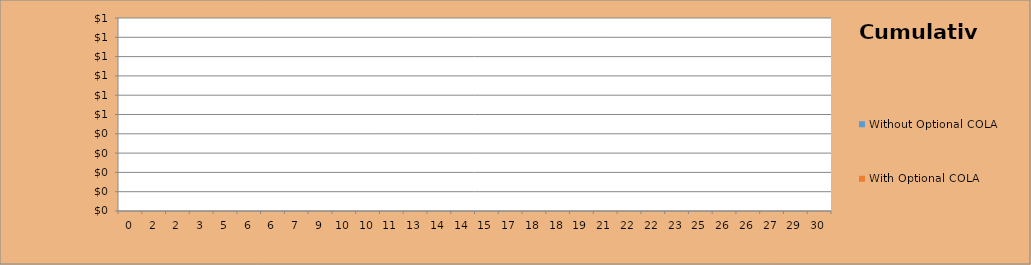
| Category | Without Optional COLA | With Optional COLA |
|---|---|---|
| 0.0 | 0 | 0 |
| 1.5003422313483916 | 0 | 0 |
| 2.4996577686516086 | 0 | 0 |
| 3.4989733059548254 | 0 | 0 |
| 4.501026694045175 | 0 | 0 |
| 5.500342231348392 | 0 | 0 |
| 6.499657768651608 | 0 | 0 |
| 7.498973305954825 | 0 | 0 |
| 8.501026694045175 | 0 | 0 |
| 9.500342231348391 | 0 | 0 |
| 10.499657768651609 | 0 | 0 |
| 11.498973305954825 | 0 | 0 |
| 12.501026694045175 | 0 | 0 |
| 13.500342231348391 | 0 | 0 |
| 14.499657768651609 | 0 | 0 |
| 15.498973305954825 | 0 | 0 |
| 16.501026694045173 | 0 | 0 |
| 17.50034223134839 | 0 | 0 |
| 18.49965776865161 | 0 | 0 |
| 19.498973305954827 | 0 | 0 |
| 20.501026694045173 | 0 | 0 |
| 21.50034223134839 | 0 | 0 |
| 22.49965776865161 | 0 | 0 |
| 23.498973305954827 | 0 | 0 |
| 24.501026694045173 | 0 | 0 |
| 25.50034223134839 | 0 | 0 |
| 26.49965776865161 | 0 | 0 |
| 27.498973305954827 | 0 | 0 |
| 28.501026694045173 | 0 | 0 |
| 29.50034223134839 | 0 | 0 |